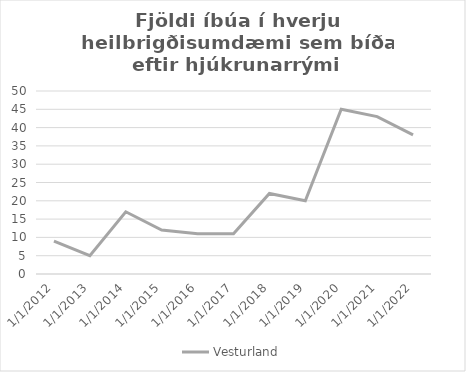
| Category | Vesturland |
|---|---|
| 1/1/12 | 9 |
| 1/1/13 | 5 |
| 1/1/14 | 17 |
| 1/1/15 | 12 |
| 1/1/16 | 11 |
| 1/1/17 | 11 |
| 1/1/18 | 22 |
| 1/1/19 | 20 |
| 1/1/20 | 45 |
| 1/1/21 | 43 |
| 1/1/22 | 38 |